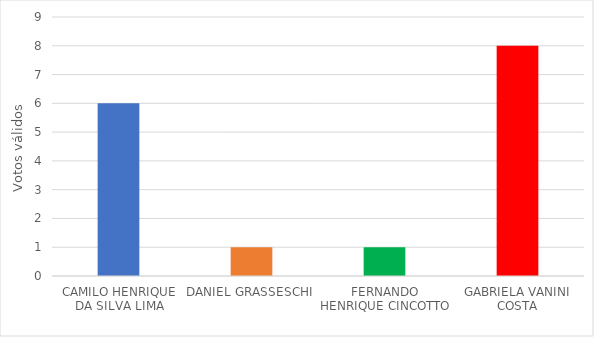
| Category | Series 0 |
|---|---|
| CAMILO HENRIQUE DA SILVA LIMA | 6 |
| DANIEL GRASSESCHI | 1 |
| FERNANDO HENRIQUE CINCOTTO | 1 |
| GABRIELA VANINI COSTA | 8 |